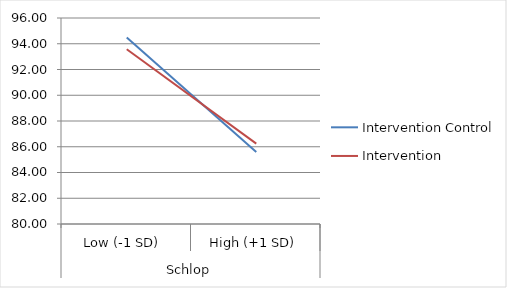
| Category | Intervention Control | Treatment |
|---|---|---|
| 0 | 94.493 | 93.575 |
| 1 | 85.589 | 86.243 |